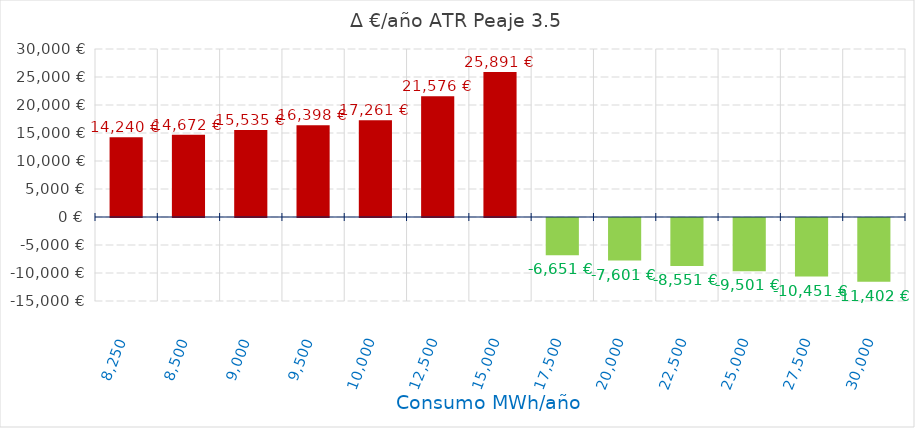
| Category | D €/año |
|---|---|
| 8250.0 | 14240.128 |
| 8500.0 | 14671.647 |
| 9000.0 | 15534.685 |
| 9500.0 | 16397.723 |
| 10000.0 | 17260.761 |
| 12500.0 | 21575.951 |
| 15000.0 | 25891.142 |
| 17500.0 | -6650.896 |
| 20000.0 | -7601.024 |
| 22500.0 | -8551.152 |
| 25000.0 | -9501.28 |
| 27500.0 | -10451.408 |
| 30000.0 | -11401.536 |